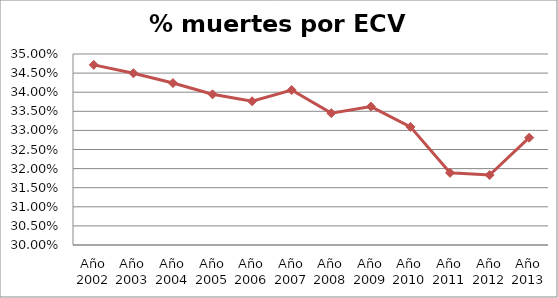
| Category | Series 0 |
|---|---|
| Año 2002 | 0.347 |
| Año 2003 | 0.345 |
| Año 2004 | 0.342 |
| Año 2005 | 0.339 |
| Año 2006 | 0.338 |
| Año 2007 | 0.341 |
| Año 2008 | 0.335 |
| Año 2009 | 0.336 |
| Año 2010 | 0.331 |
| Año 2011 | 0.319 |
| Año 2012 | 0.318 |
| Año 2013 | 0.328 |